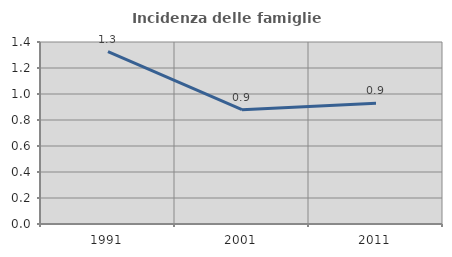
| Category | Incidenza delle famiglie numerose |
|---|---|
| 1991.0 | 1.327 |
| 2001.0 | 0.88 |
| 2011.0 | 0.929 |